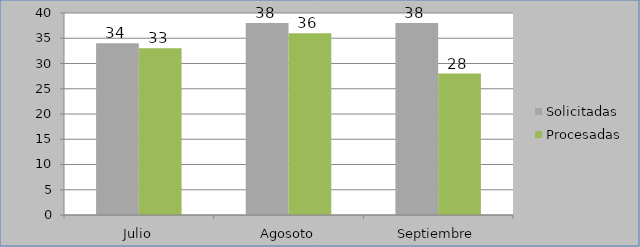
| Category | Solicitadas | Procesadas |
|---|---|---|
| Julio | 34 | 33 |
| Agosoto | 38 | 36 |
| Septiembre | 38 | 28 |